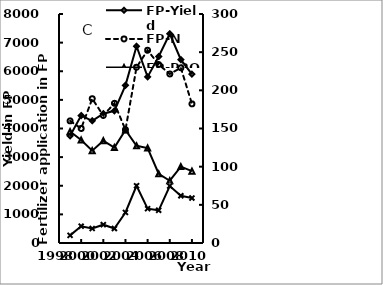
| Category | FP-Yield |
|---|---|
| 1999.0 | 3746 |
| 2000.0 | 4453 |
| 2001.0 | 4269 |
| 2002.0 | 4518 |
| 2003.0 | 4617.8 |
| 2004.0 | 5506.78 |
| 2005.0 | 6872.167 |
| 2006.0 | 5801.7 |
| 2007.0 | 6515.489 |
| 2008.0 | 7310.583 |
| 2009.0 | 6405.083 |
| 2010.0 | 5898.356 |